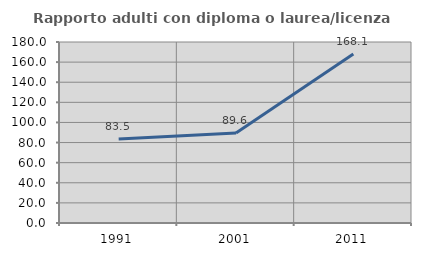
| Category | Rapporto adulti con diploma o laurea/licenza media  |
|---|---|
| 1991.0 | 83.471 |
| 2001.0 | 89.571 |
| 2011.0 | 168.072 |